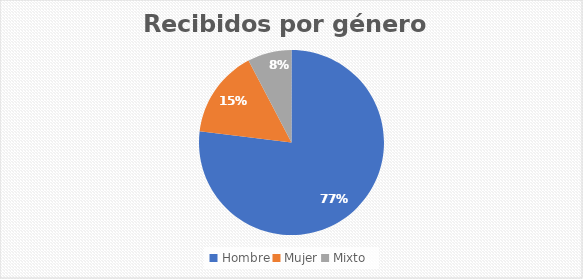
| Category | Recibidos por género  Cantidad |
|---|---|
| Hombre | 10 |
| Mujer | 2 |
| Mixto | 1 |